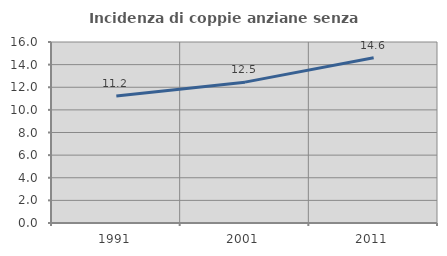
| Category | Incidenza di coppie anziane senza figli  |
|---|---|
| 1991.0 | 11.232 |
| 2001.0 | 12.452 |
| 2011.0 | 14.601 |